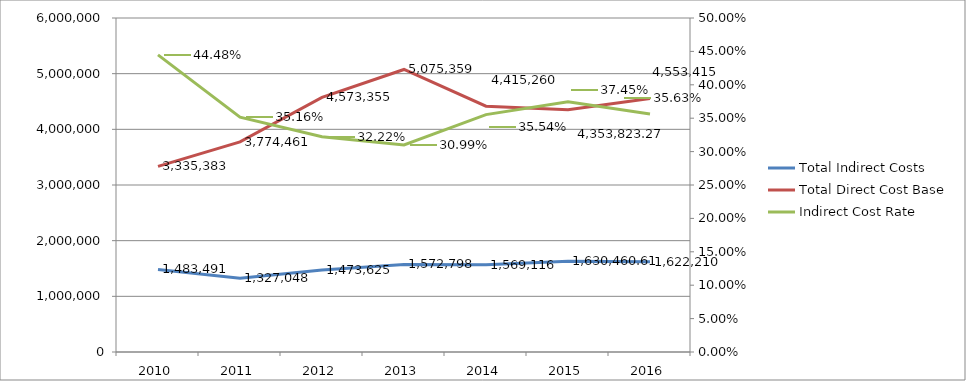
| Category | Total Indirect Costs | Total Direct Cost Base |
|---|---|---|
| 2010.0 | 1483490.78 | 3335383 |
| 2011.0 | 1327047.51 | 3774460.75 |
| 2012.0 | 1473625.18 | 4573354.86 |
| 2013.0 | 1572798.42 | 5075359 |
| 2014.0 | 1569116.27 | 4415260.39 |
| 2015.0 | 1630460.61 | 4353823.27 |
| 2016.0 | 1622210 | 4553415 |